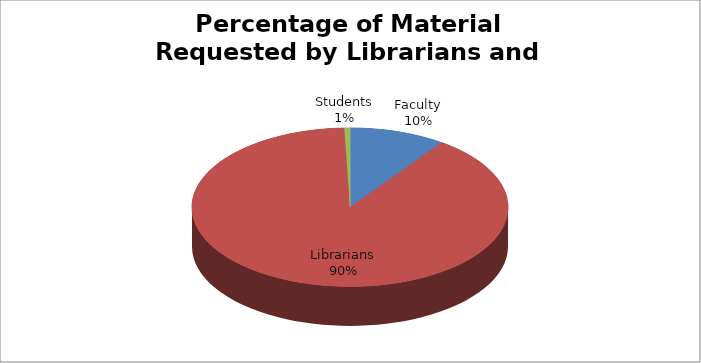
| Category | Series 0 |
|---|---|
| Faculty | 170 |
| Librarians | 1551 |
| Students | 10 |